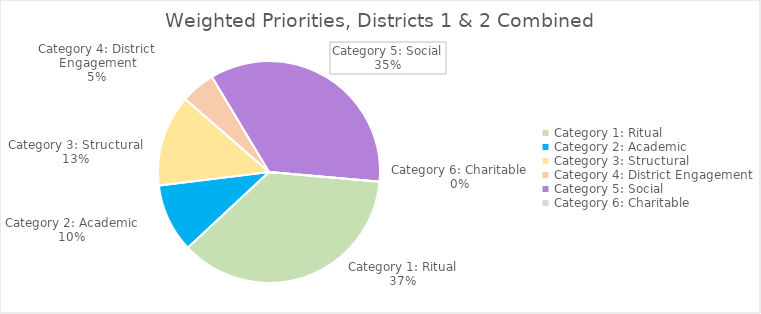
| Category | Combined |
|---|---|
| Category 1: Ritual | 22 |
| Category 2: Academic | 6 |
| Category 3: Structural | 8 |
| Category 4: District Engagement | 3 |
| Category 5: Social | 21 |
| Category 6: Charitable | 0 |